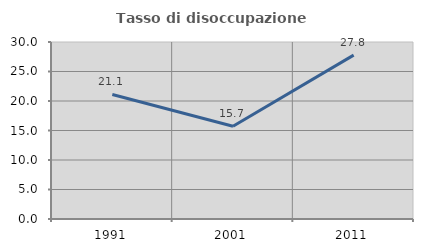
| Category | Tasso di disoccupazione giovanile  |
|---|---|
| 1991.0 | 21.113 |
| 2001.0 | 15.725 |
| 2011.0 | 27.778 |